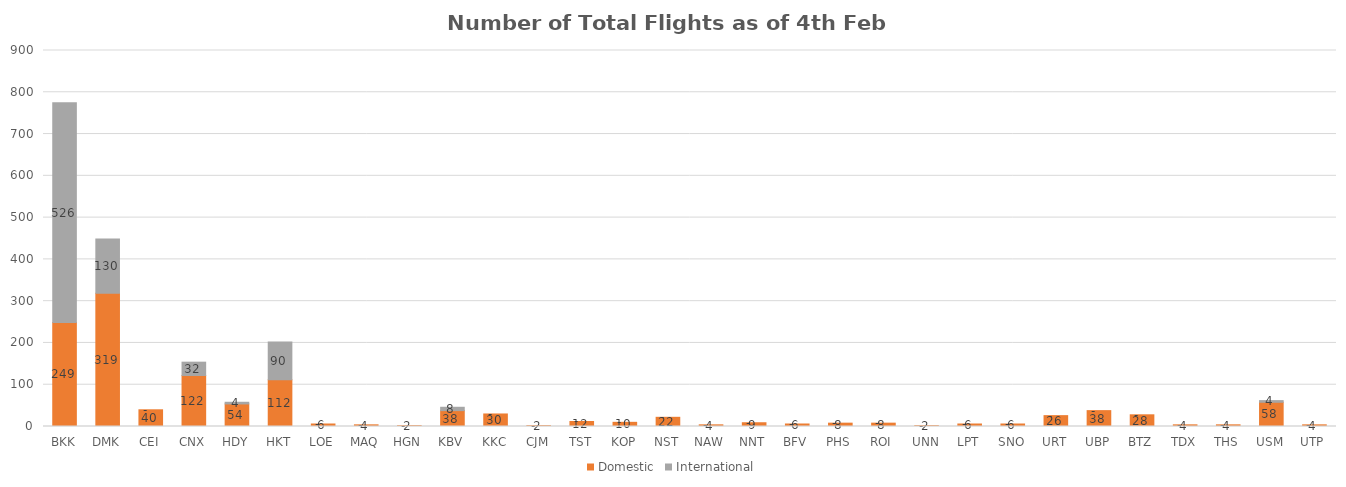
| Category | Domestic | International |
|---|---|---|
| BKK | 249 | 526 |
| DMK | 319 | 130 |
| CEI | 40 | 0 |
| CNX | 122 | 32 |
| HDY | 54 | 4 |
| HKT | 112 | 90 |
| LOE | 6 | 0 |
| MAQ | 4 | 0 |
| HGN | 2 | 0 |
| KBV | 38 | 8 |
| KKC | 30 | 0 |
| CJM | 2 | 0 |
| TST | 12 | 0 |
| KOP | 10 | 0 |
| NST | 22 | 0 |
| NAW | 4 | 0 |
| NNT | 9 | 0 |
| BFV | 6 | 0 |
| PHS | 8 | 0 |
| ROI | 8 | 0 |
| UNN | 2 | 0 |
| LPT | 6 | 0 |
| SNO | 6 | 0 |
| URT | 26 | 0 |
| UBP | 38 | 0 |
| BTZ | 28 | 0 |
| TDX | 4 | 0 |
| THS | 4 | 0 |
| USM | 58 | 4 |
| UTP | 4 | 0 |